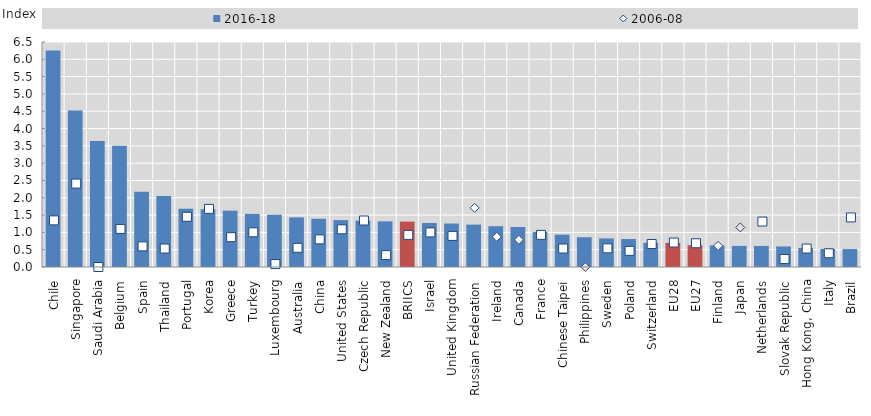
| Category | 2016-18 |
|---|---|
| Chile | 6.255 |
| Singapore | 4.52 |
| Saudi Arabia | 3.643 |
| Belgium | 3.505 |
| Spain | 2.17 |
| Thailand | 2.053 |
| Portugal | 1.684 |
| Korea | 1.67 |
| Greece | 1.627 |
| Turkey | 1.534 |
| Luxembourg | 1.511 |
| Australia | 1.433 |
| China | 1.393 |
| United States | 1.354 |
| Czech Republic | 1.339 |
| New Zealand | 1.318 |
| BRIICS | 1.311 |
| Israel | 1.272 |
| United Kingdom | 1.256 |
| Russian Federation | 1.225 |
| Ireland | 1.178 |
| Canada | 1.155 |
| France | 1.014 |
| Chinese Taipei | 0.935 |
| Philippines | 0.86 |
| Sweden | 0.826 |
| Poland | 0.808 |
| Switzerland | 0.699 |
| EU28 | 0.695 |
| EU27 | 0.63 |
| Finland | 0.622 |
| Japan | 0.609 |
| Netherlands | 0.608 |
| Slovak Republic | 0.594 |
| Hong Kong, China | 0.552 |
| Italy | 0.52 |
| Brazil | 0.519 |